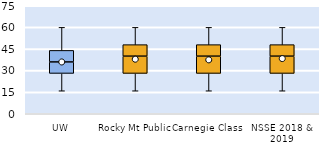
| Category | 25th | 50th | 75th |
|---|---|---|---|
| UW | 28 | 8 | 8 |
| Rocky Mt Public | 28 | 12 | 8 |
| Carnegie Class | 28 | 12 | 8 |
| NSSE 2018 & 2019 | 28 | 12 | 8 |